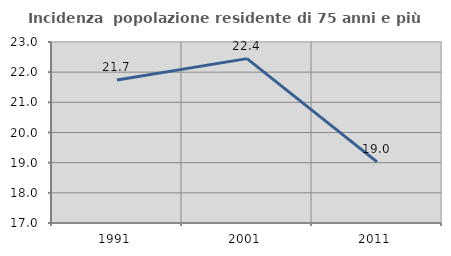
| Category | Incidenza  popolazione residente di 75 anni e più |
|---|---|
| 1991.0 | 21.739 |
| 2001.0 | 22.449 |
| 2011.0 | 19.027 |